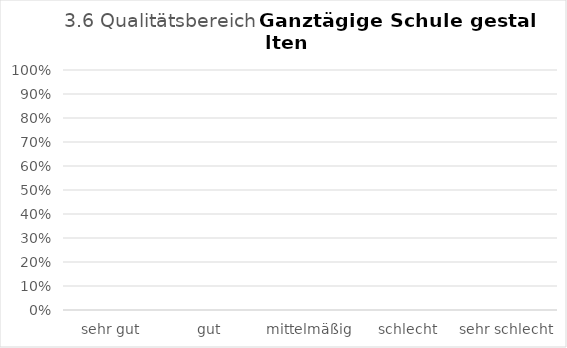
| Category | Series 0 |
|---|---|
| sehr gut | 0 |
| gut | 0 |
| mittelmäßig | 0 |
| schlecht | 0 |
| sehr schlecht | 0 |